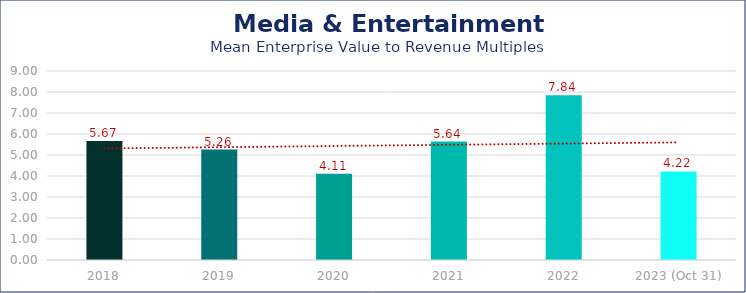
| Category | Media & Entertainment |
|---|---|
| 2018 | 5.67 |
| 2019 | 5.26 |
| 2020 | 4.11 |
| 2021 | 5.64 |
| 2022 | 7.84 |
| 2023 (Oct 31) | 4.22 |